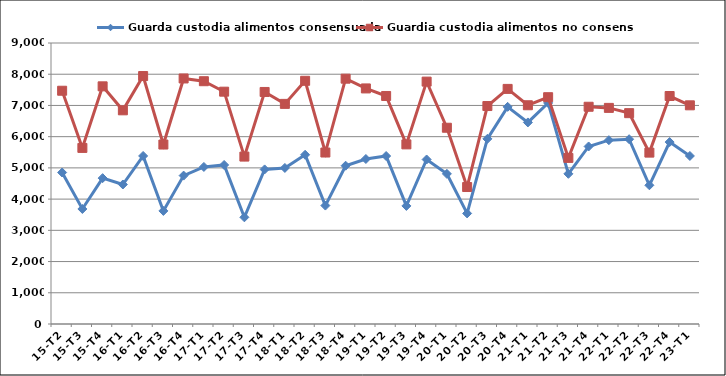
| Category | Guarda custodia alimentos consensuada | Guardia custodia alimentos no consensuada |
|---|---|---|
| 15-T2 | 4852 | 7471 |
| 15-T3 | 3684 | 5640 |
| 15-T4 | 4672 | 7612 |
| 16-T1 | 4468 | 6844 |
| 16-T2 | 5382 | 7942 |
| 16-T3 | 3622 | 5748 |
| 16-T4 | 4753 | 7864 |
| 17-T1 | 5030 | 7776 |
| 17-T2 | 5094 | 7441 |
| 17-T3 | 3417 | 5362 |
| 17-T4 | 4951 | 7432 |
| 18-T1 | 4998 | 7050 |
| 18-T2 | 5420 | 7789 |
| 18-T3 | 3793 | 5492 |
| 18-T4 | 5070 | 7857 |
| 19-T1 | 5285 | 7545 |
| 19-T2 | 5380 | 7303 |
| 19-T3 | 3782 | 5753 |
| 19-T4 | 5269 | 7763 |
| 20-T1 | 4809 | 6286 |
| 20-T2 | 3542 | 4387 |
| 20-T3 | 5930 | 6981 |
| 20-T4 | 6955 | 7530 |
| 21-T1 | 6456 | 7006 |
| 21-T2 | 7080 | 7264 |
| 21-T3 | 4810 | 5320 |
| 21-T4 | 5686 | 6958 |
| 22-T1 | 5888 | 6922 |
| 22-T2 | 5919 | 6753 |
| 22-T3 | 4443 | 5489 |
| 22-T4 | 5827 | 7302 |
| 23-T1 | 5382 | 7004 |